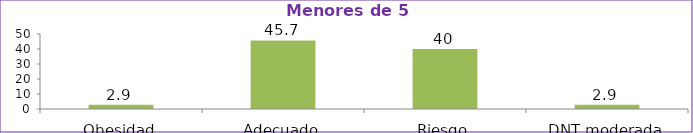
| Category | Series 0 |
|---|---|
| Obesidad | 2.9 |
| Adecuado | 45.7 |
| Riesgo | 40 |
| DNT moderada | 2.9 |